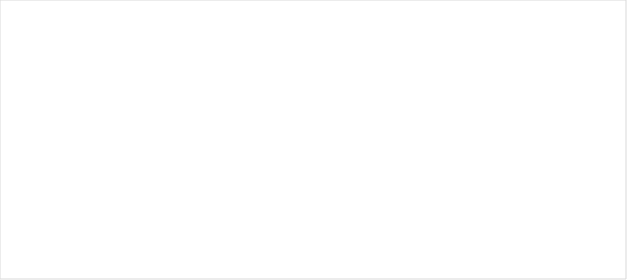
| Category | 2016 | 2019 |
|---|---|---|
| D | 7 | 6 |
| C | 2 | 3 |
| B | 1 | 1 |